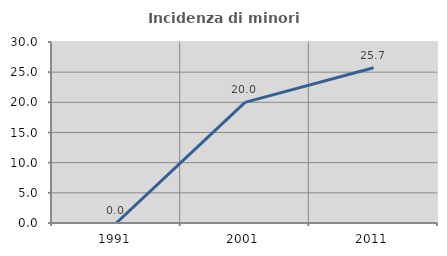
| Category | Incidenza di minori stranieri |
|---|---|
| 1991.0 | 0 |
| 2001.0 | 20 |
| 2011.0 | 25.731 |